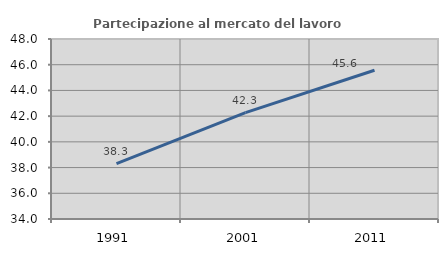
| Category | Partecipazione al mercato del lavoro  femminile |
|---|---|
| 1991.0 | 38.308 |
| 2001.0 | 42.268 |
| 2011.0 | 45.567 |